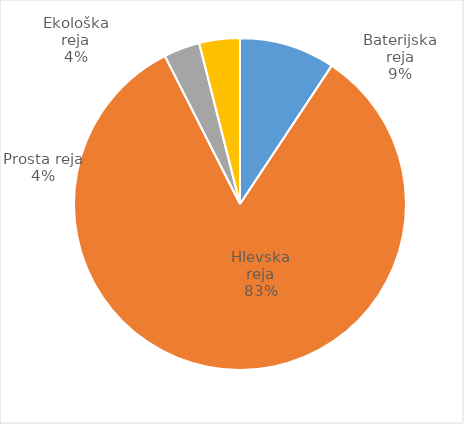
| Category | Število kosov jajc |
|---|---|
| Baterijska reja | 336713 |
| Hlevska reja | 3006789 |
| Prosta reja | 127197 |
| Ekološka reja | 143100 |